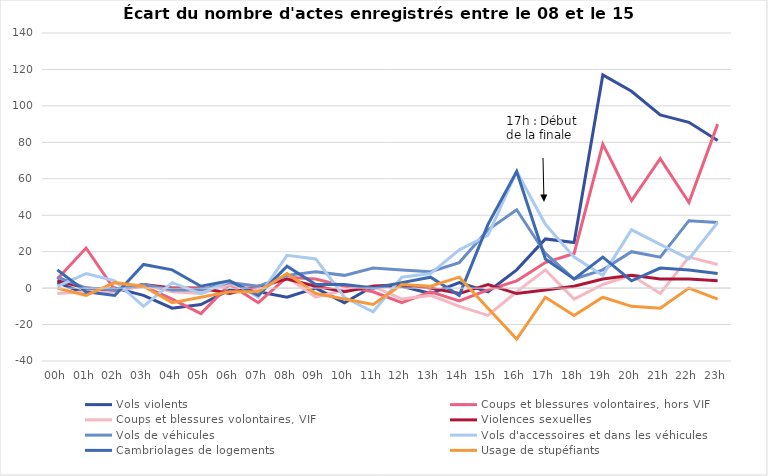
| Category | Vols violents | Coups et blessures volontaires, hors VIF | Coups et blessures volontaires, VIF | Violences sexuelles | Vols de véhicules | Vols d'accessoires et dans les véhicules | Cambriolages de logements | Usage de stupéfiants |
|---|---|---|---|---|---|---|---|---|
| 00h | 3 | 5 | -3 | 4 | 6 | 1 | 10 | 0 |
| 01h | -3 | 22 | -2 | 0 | 0 | 8 | -2 | -4 |
| 02h | 0 | -1 | -2 | -1 | -1 | 4 | -4 | 3 |
| 03h | -4 | 1 | 2 | 2 | 2 | -10 | 13 | 1 |
| 04h | -11 | -6 | -2 | 0 | -1 | 3 | 10 | -8 |
| 05h | -9 | -14 | -3 | 0 | -1 | -3 | 1 | -5 |
| 06h | -1 | 2 | 2 | -3 | 3 | 4 | 4 | -2 |
| 07h | -2 | -8 | -1 | 1 | 1 | -5 | -4 | -2 |
| 08h | -5 | 6 | 6 | 5 | 7 | 18 | 12 | 8 |
| 09h | 0 | 5 | -5 | 1 | 9 | 16 | 2 | -3 |
| 10h | -8 | 1 | -1 | -2 | 7 | -5 | 2 | -6 |
| 11h | 1 | -2 | 1 | 1 | 11 | -13 | 0 | -9 |
| 12h | 1 | -8 | -6 | 2 | 10 | 6 | 3 | 2 |
| 13h | -3 | -2 | -4 | 0 | 9 | 8 | 6 | 1 |
| 14h | 3 | -7 | -10 | -3 | 14 | 21 | -4 | 6 |
| 15h | -2 | -1 | -15 | 2 | 32 | 29 | 35 | -11 |
| 16h | 10 | 4 | -2 | -3 | 43 | 64 | 64 | -28 |
| 17h | 27 | 14 | 10 | -1 | 19 | 35 | 16 | -5 |
| 18h | 25 | 19 | -6 | 1 | 5 | 17 | 5 | -15 |
| 19h | 117 | 79 | 2 | 5 | 10 | 7 | 17 | -5 |
| 20h | 108 | 48 | 7 | 7 | 20 | 32 | 4 | -10 |
| 21h | 95 | 71 | -3 | 5 | 17 | 24 | 11 | -11 |
| 22h | 91 | 47 | 17 | 5 | 37 | 16 | 10 | 0 |
| 23h | 81 | 90 | 13 | 4 | 36 | 36 | 8 | -6 |